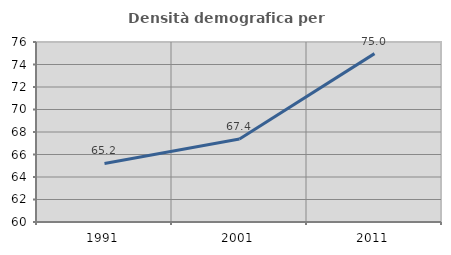
| Category | Densità demografica |
|---|---|
| 1991.0 | 65.206 |
| 2001.0 | 67.371 |
| 2011.0 | 74.967 |